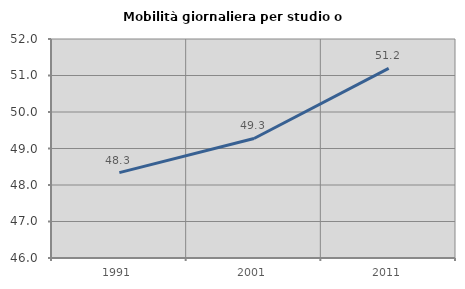
| Category | Mobilità giornaliera per studio o lavoro |
|---|---|
| 1991.0 | 48.339 |
| 2001.0 | 49.275 |
| 2011.0 | 51.196 |